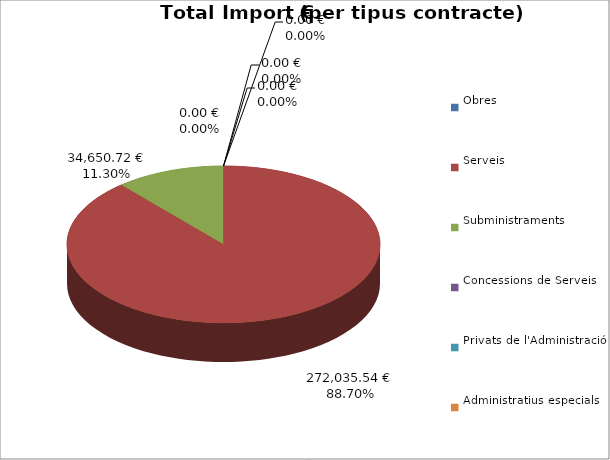
| Category | Total preu
(amb IVA) |
|---|---|
| Obres | 0 |
| Serveis | 272035.54 |
| Subministraments | 34650.72 |
| Concessions de Serveis | 0 |
| Privats de l'Administració | 0 |
| Administratius especials | 0 |